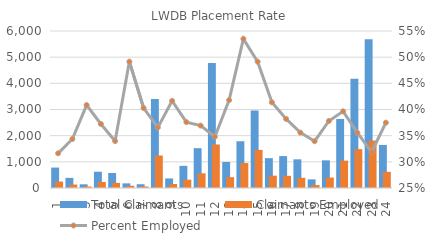
| Category | Total Claimants | Claimants Employed |
|---|---|---|
| 1.0 | 781 | 247 |
| 2.0 | 387 | 133 |
| 3.0 | 142 | 58 |
| 4.0 | 623 | 232 |
| 5.0 | 574 | 195 |
| 6.0 | 177 | 87 |
| 7.0 | 144 | 58 |
| 8.0 | 3398 | 1243 |
| 9.0 | 365 | 152 |
| 10.0 | 846 | 318 |
| 11.0 | 1522 | 562 |
| 12.0 | 4779 | 1663 |
| 13.0 | 993 | 415 |
| 14.0 | 1787 | 956 |
| 15.0 | 2963 | 1456 |
| 16.0 | 1141 | 472 |
| 17.0 | 1220 | 466 |
| 18.0 | 1096 | 390 |
| 19.0 | 330 | 112 |
| 20.0 | 1058 | 400 |
| 21.0 | 2638 | 1046 |
| 22.0 | 4176 | 1485 |
| 23.0 | 5688 | 1813 |
| 24.0 | 1646 | 617 |